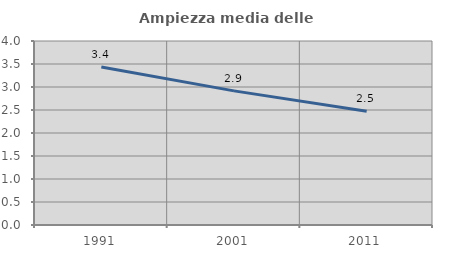
| Category | Ampiezza media delle famiglie |
|---|---|
| 1991.0 | 3.433 |
| 2001.0 | 2.915 |
| 2011.0 | 2.473 |